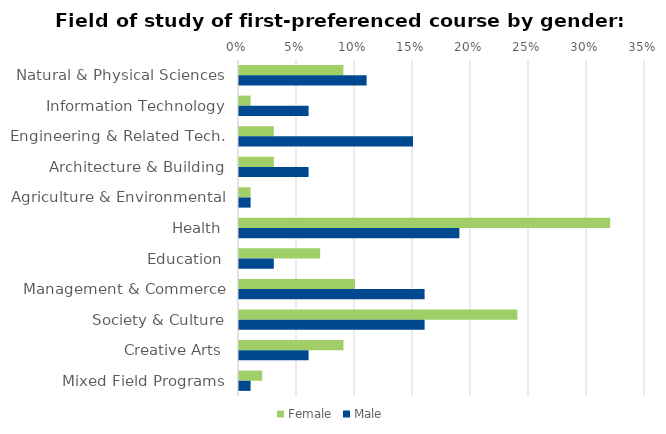
| Category | Female | Male |
|---|---|---|
| Natural & Physical Sciences | 0.09 | 0.11 |
| Information Technology | 0.01 | 0.06 |
| Engineering & Related Tech. | 0.03 | 0.15 |
| Architecture & Building | 0.03 | 0.06 |
| Agriculture & Environmental | 0.01 | 0.01 |
| Health | 0.32 | 0.19 |
| Education | 0.07 | 0.03 |
| Management & Commerce | 0.1 | 0.16 |
| Society & Culture | 0.24 | 0.16 |
| Creative Arts | 0.09 | 0.06 |
| Mixed Field Programs | 0.02 | 0.01 |